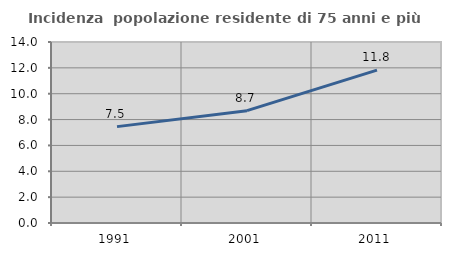
| Category | Incidenza  popolazione residente di 75 anni e più |
|---|---|
| 1991.0 | 7.454 |
| 2001.0 | 8.689 |
| 2011.0 | 11.821 |